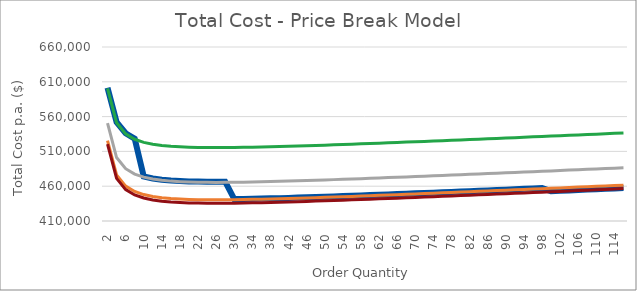
| Category | Series 0 | Total Cost @ $1000 | Total Cost @ $900 | Total Cost @ $850 | Total Cost @ $840 |
|---|---|---|---|---|---|
| 2.0 | 601600 | 600600 | 550600 | 525600 | 520600 |
| 4.0 | 552200 | 551200 | 501200 | 476200 | 471200 |
| 6.0 | 536133.333 | 535133.333 | 485133.333 | 460133.333 | 455133.333 |
| 8.0 | 528400 | 527400 | 477400 | 452400 | 447400 |
| 10.0 | 473900 | 523000 | 473000 | 448000 | 443000 |
| 12.0 | 471166.667 | 520266.667 | 470266.667 | 445266.667 | 440266.667 |
| 14.0 | 469385.714 | 518485.714 | 468485.714 | 443485.714 | 438485.714 |
| 16.0 | 468200 | 517300 | 467300 | 442300 | 437300 |
| 18.0 | 467411.111 | 516511.111 | 466511.111 | 441511.111 | 436511.111 |
| 20.0 | 466900 | 516000 | 466000 | 441000 | 436000 |
| 22.0 | 466590.909 | 515690.909 | 465690.909 | 440690.909 | 435690.909 |
| 24.0 | 466433.333 | 515533.333 | 465533.333 | 440533.333 | 435533.333 |
| 26.0 | 466392.308 | 515492.308 | 465492.308 | 440492.308 | 435492.308 |
| 28.0 | 466442.857 | 515542.857 | 465542.857 | 440542.857 | 435542.857 |
| 30.0 | 441516.667 | 515666.667 | 465666.667 | 440666.667 | 435666.667 |
| 32.0 | 441700 | 515850 | 465850 | 440850 | 435850 |
| 34.0 | 441932.353 | 516082.353 | 466082.353 | 441082.353 | 436082.353 |
| 36.0 | 442205.556 | 516355.556 | 466355.556 | 441355.556 | 436355.556 |
| 38.0 | 442513.158 | 516663.158 | 466663.158 | 441663.158 | 436663.158 |
| 40.0 | 442850 | 517000 | 467000 | 442000 | 437000 |
| 42.0 | 443211.905 | 517361.905 | 467361.905 | 442361.905 | 437361.905 |
| 44.0 | 443595.455 | 517745.455 | 467745.455 | 442745.455 | 437745.455 |
| 46.0 | 443997.826 | 518147.826 | 468147.826 | 443147.826 | 438147.826 |
| 48.0 | 444416.667 | 518566.667 | 468566.667 | 443566.667 | 438566.667 |
| 50.0 | 444850 | 519000 | 469000 | 444000 | 439000 |
| 52.0 | 445296.154 | 519446.154 | 469446.154 | 444446.154 | 439446.154 |
| 54.0 | 445753.704 | 519903.704 | 469903.704 | 444903.704 | 439903.704 |
| 56.0 | 446221.429 | 520371.429 | 470371.429 | 445371.429 | 440371.429 |
| 58.0 | 446698.276 | 520848.276 | 470848.276 | 445848.276 | 440848.276 |
| 60.0 | 447183.333 | 521333.333 | 471333.333 | 446333.333 | 441333.333 |
| 62.0 | 447675.806 | 521825.806 | 471825.806 | 446825.806 | 441825.806 |
| 64.0 | 448175 | 522325 | 472325 | 447325 | 442325 |
| 66.0 | 448680.303 | 522830.303 | 472830.303 | 447830.303 | 442830.303 |
| 68.0 | 449191.176 | 523341.176 | 473341.176 | 448341.176 | 443341.176 |
| 70.0 | 449707.143 | 523857.143 | 473857.143 | 448857.143 | 443857.143 |
| 72.0 | 450227.778 | 524377.778 | 474377.778 | 449377.778 | 444377.778 |
| 74.0 | 450752.703 | 524902.703 | 474902.703 | 449902.703 | 444902.703 |
| 76.0 | 451281.579 | 525431.579 | 475431.579 | 450431.579 | 445431.579 |
| 78.0 | 451814.103 | 525964.103 | 475964.103 | 450964.103 | 445964.103 |
| 80.0 | 452350 | 526500 | 476500 | 451500 | 446500 |
| 82.0 | 452889.024 | 527039.024 | 477039.024 | 452039.024 | 447039.024 |
| 84.0 | 453430.952 | 527580.952 | 477580.952 | 452580.952 | 447580.952 |
| 86.0 | 453975.581 | 528125.581 | 478125.581 | 453125.581 | 448125.581 |
| 88.0 | 454522.727 | 528672.727 | 478672.727 | 453672.727 | 448672.727 |
| 90.0 | 455072.222 | 529222.222 | 479222.222 | 454222.222 | 449222.222 |
| 92.0 | 455623.913 | 529773.913 | 479773.913 | 454773.913 | 449773.913 |
| 94.0 | 456177.66 | 530327.66 | 480327.66 | 455327.66 | 450327.66 |
| 96.0 | 456733.333 | 530883.333 | 480883.333 | 455883.333 | 450883.333 |
| 98.0 | 457290.816 | 531440.816 | 481440.816 | 456440.816 | 451440.816 |
| 100.0 | 452840 | 532000 | 482000 | 457000 | 452000 |
| 102.0 | 453400.784 | 532560.784 | 482560.784 | 457560.784 | 452560.784 |
| 104.0 | 453963.077 | 533123.077 | 483123.077 | 458123.077 | 453123.077 |
| 106.0 | 454526.792 | 533686.792 | 483686.792 | 458686.792 | 453686.792 |
| 108.0 | 455091.852 | 534251.852 | 484251.852 | 459251.852 | 454251.852 |
| 110.0 | 455658.182 | 534818.182 | 484818.182 | 459818.182 | 454818.182 |
| 112.0 | 456225.714 | 535385.714 | 485385.714 | 460385.714 | 455385.714 |
| 114.0 | 456794.386 | 535954.386 | 485954.386 | 460954.386 | 455954.386 |
| 116.0 | 457364.138 | 536524.138 | 486524.138 | 461524.138 | 456524.138 |